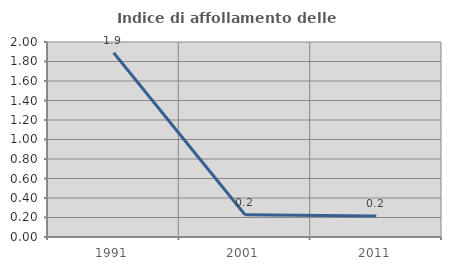
| Category | Indice di affollamento delle abitazioni  |
|---|---|
| 1991.0 | 1.889 |
| 2001.0 | 0.228 |
| 2011.0 | 0.215 |